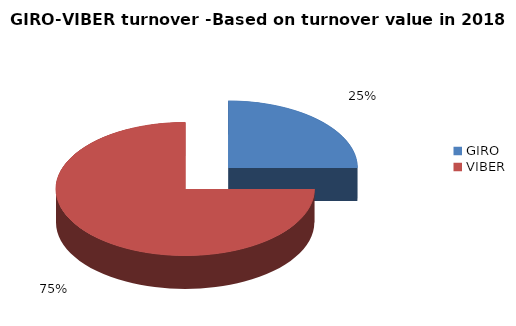
| Category | Forgalmi érték alapján 2016-ban |
|---|---|
| GIRO | 0.25 |
| VIBER | 0.75 |